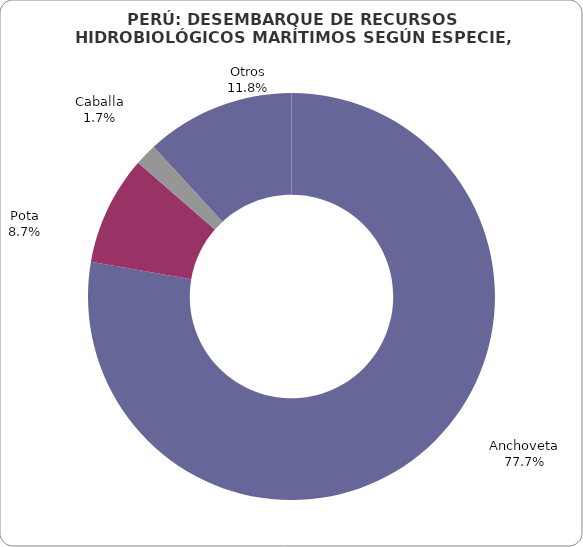
| Category | Series 0 |
|---|---|
| Anchoveta | 4401317.64 |
| Pota | 492362.75 |
| Caballa | 98686.17 |
| Otros | 670507.55 |